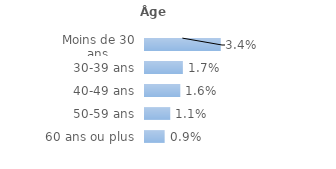
| Category | Series 0 |
|---|---|
| Moins de 30 ans | 0.034 |
| 30-39 ans | 0.017 |
| 40-49 ans | 0.016 |
| 50-59 ans | 0.011 |
| 60 ans ou plus | 0.009 |